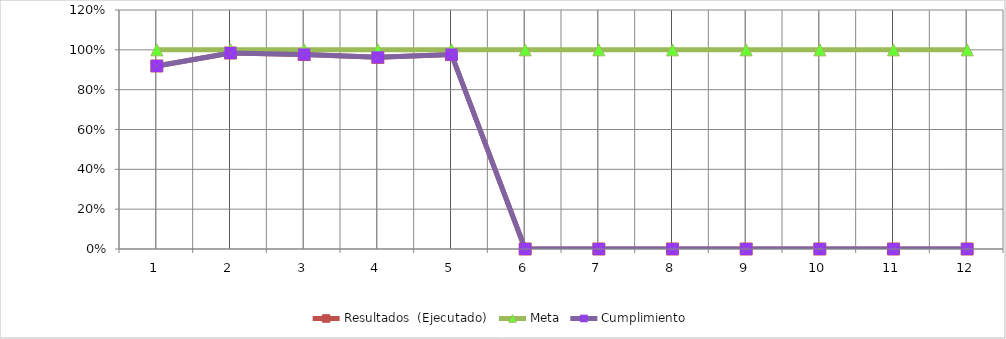
| Category | Resultados  (Ejecutado) | Meta | Cumplimiento |
|---|---|---|---|
| 0 | 0.919 | 1 | 0.919 |
| 1 | 0.984 | 1 | 0.984 |
| 2 | 0.977 | 1 | 0.977 |
| 3 | 0.962 | 1 | 0.962 |
| 4 | 0.977 | 1 | 0.977 |
| 5 | 0 | 1 | 0 |
| 6 | 0 | 1 | 0 |
| 7 | 0 | 1 | 0 |
| 8 | 0 | 1 | 0 |
| 9 | 0 | 1 | 0 |
| 10 | 0 | 1 | 0 |
| 11 | 0 | 1 | 0 |